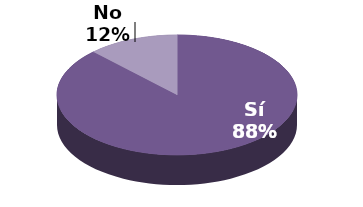
| Category | Series 1 |
|---|---|
| Sí | 43 |
| No | 6 |